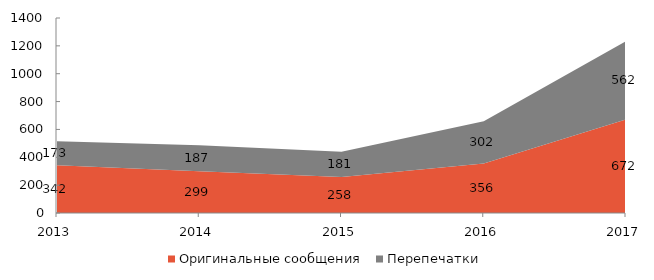
| Category | Оригинальные сообщения | Перепечатки |
|---|---|---|
| 2013 | 342 | 173 |
| 2014 | 299 | 187 |
| 2015 | 258 | 181 |
| 2016 | 356 | 302 |
| 2017 | 672 | 562 |